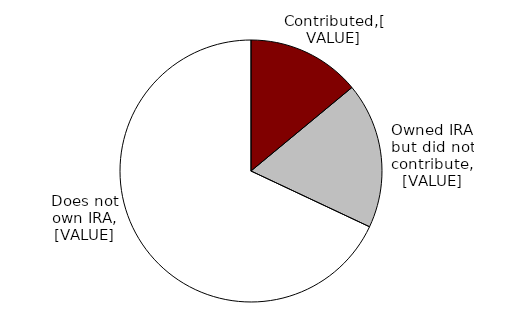
| Category | Series 0 |
|---|---|
| Contributed | 0.14 |
| Owned IRA but did not contribute | 0.18 |
| Does not own IRA | 0.68 |